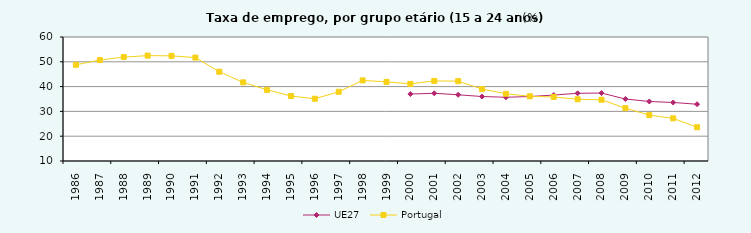
| Category | UE27 | Portugal |
|---|---|---|
| 1986 | 0 | 48.8 |
| 1987 | 0 | 50.7 |
| 1988 | 0 | 51.9 |
| 1989 | 0 | 52.5 |
| 1990 | 0 | 52.4 |
| 1991 | 0 | 51.7 |
| 1992 | 0 | 46 |
| 1993 | 0 | 41.7 |
| 1994 | 0 | 38.7 |
| 1995 | 0 | 36.2 |
| 1996 | 0 | 35.1 |
| 1997 | 0 | 37.9 |
| 1998 | 0 | 42.5 |
| 1999 | 0 | 41.9 |
| 2000 | 37 | 41.1 |
| 2001 | 37.3 | 42.3 |
| 2002 | 36.7 | 42.2 |
| 2003 | 36 | 39 |
| 2004 | 35.7 | 37.1 |
| 2005 | 36 | 36.1 |
| 2006 | 36.6 | 35.8 |
| 2007 | 37.3 | 34.9 |
| 2008 | 37.4 | 34.7 |
| 2009 | 35 | 31.3 |
| 2010 | 34 | 28.5 |
| 2011 | 33.6 | 27.2 |
| 2012 | 32.9 | 23.6 |